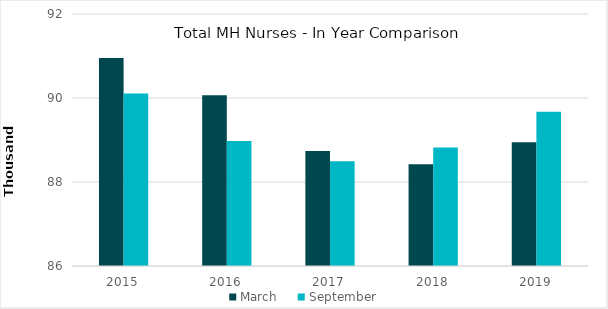
| Category | March | September |
|---|---|---|
| 2015.0 | 90953 | 90110 |
| 2016.0 | 90068 | 88974 |
| 2017.0 | 88741 | 88497 |
| 2018.0 | 88421 | 88821 |
| 2019.0 | 88944 | 89675 |